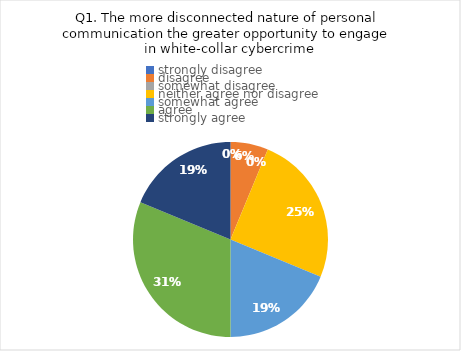
| Category | Series 0 |
|---|---|
| strongly disagree | 0 |
| disagree | 1 |
| somewhat disagree | 0 |
| neither agree nor disagree | 4 |
| somewhat agree | 3 |
| agree | 5 |
| strongly agree | 3 |